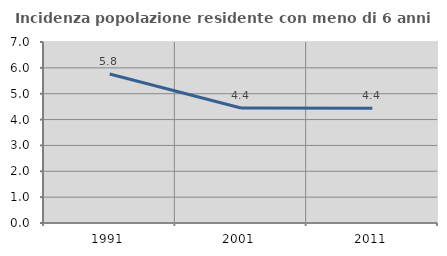
| Category | Incidenza popolazione residente con meno di 6 anni |
|---|---|
| 1991.0 | 5.765 |
| 2001.0 | 4.449 |
| 2011.0 | 4.439 |